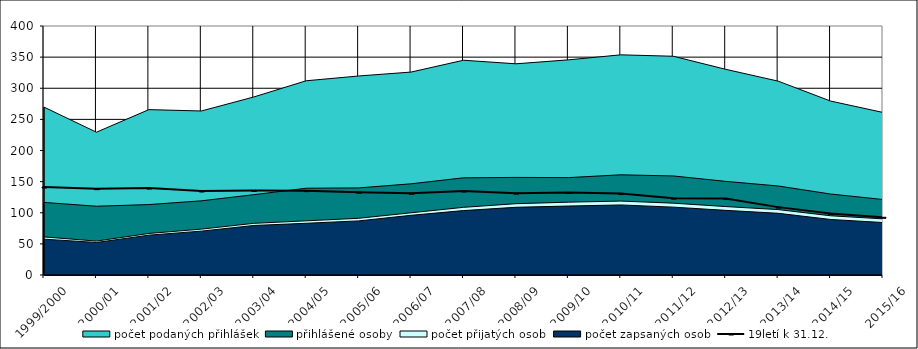
| Category | 19letí k 31.12. |
|---|---|
| 1999/2000 | 141.248 |
| 2000/01 | 138.716 |
| 2001/02 | 139.704 |
| 2002/03 | 134.929 |
| 2003/04 | 135.777 |
| 2004/05 | 135.5 |
| 2005/06 | 133.059 |
| 2006/07 | 131.319 |
| 2007/08 | 134.946 |
| 2008/09 | 131.517 |
| 2009/10 | 132.555 |
| 2010/11 | 130.795 |
| 2011/12 | 123.426 |
| 2012/13 | 122.809 |
| 2013/14 | 109.039 |
| 2014/15 | 98.773 |
| 2015/16 | 92.7 |